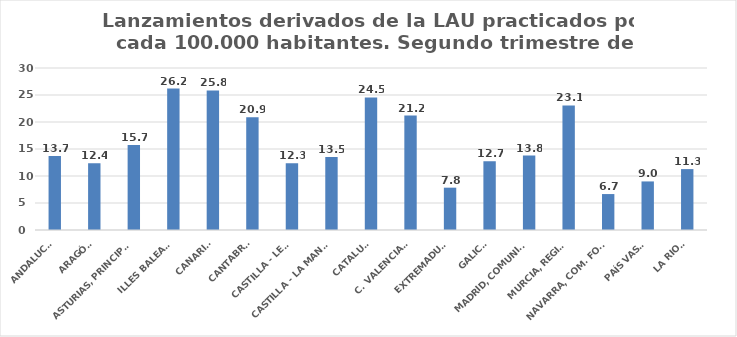
| Category | Series 0 |
|---|---|
| ANDALUCÍA | 13.723 |
| ARAGÓN | 12.374 |
| ASTURIAS, PRINCIPADO | 15.718 |
| ILLES BALEARS | 26.187 |
| CANARIAS | 25.836 |
| CANTABRIA | 20.879 |
| CASTILLA - LEÓN | 12.346 |
| CASTILLA - LA MANCHA | 13.527 |
| CATALUÑA | 24.546 |
| C. VALENCIANA | 21.191 |
| EXTREMADURA | 7.839 |
| GALICIA | 12.731 |
| MADRID, COMUNIDAD | 13.787 |
| MURCIA, REGIÓN | 23.058 |
| NAVARRA, COM. FORAL | 6.656 |
| PAÍS VASCO | 8.994 |
| LA RIOJA | 11.277 |